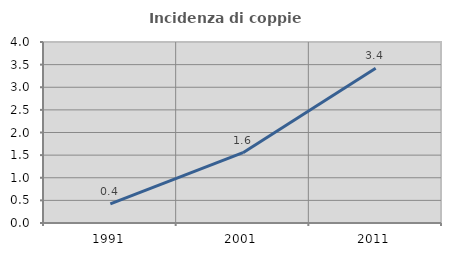
| Category | Incidenza di coppie miste |
|---|---|
| 1991.0 | 0.423 |
| 2001.0 | 1.554 |
| 2011.0 | 3.418 |